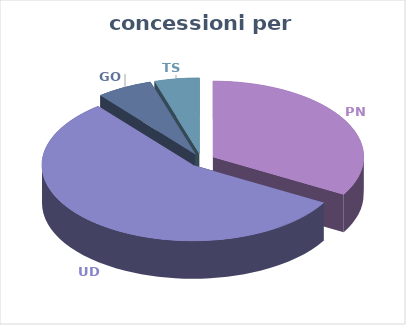
| Category | Series 0 |
|---|---|
| PN | 49795250 |
| UD | 83682524 |
| GO | 9001470 |
| TS | 7192000 |